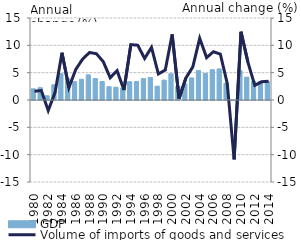
| Category | GDP |
|---|---|
| 1980.0 | 2.043 |
| 1981.0 | 2.25 |
| 1982.0 | 0.767 |
| 1983.0 | 2.785 |
| 1984.0 | 4.823 |
| 1985.0 | 3.899 |
| 1986.0 | 3.356 |
| 1987.0 | 3.795 |
| 1988.0 | 4.596 |
| 1989.0 | 3.926 |
| 1990.0 | 3.383 |
| 1991.0 | 2.433 |
| 1992.0 | 2.346 |
| 1993.0 | 2.159 |
| 1994.0 | 3.34 |
| 1995.0 | 3.372 |
| 1996.0 | 3.897 |
| 1997.0 | 4.127 |
| 1998.0 | 2.521 |
| 1999.0 | 3.625 |
| 2000.0 | 4.795 |
| 2001.0 | 2.484 |
| 2002.0 | 2.938 |
| 2003.0 | 4.039 |
| 2004.0 | 5.378 |
| 2005.0 | 4.861 |
| 2006.0 | 5.535 |
| 2007.0 | 5.684 |
| 2008.0 | 3.058 |
| 2009.0 | -0.009 |
| 2010.0 | 5.379 |
| 2011.0 | 4.169 |
| 2012.0 | 3.404 |
| 2013.0 | 3.408 |
| 2014.0 | 3.389 |